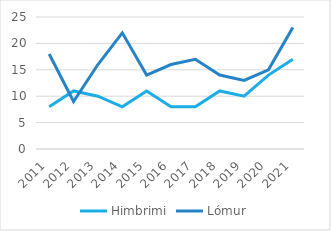
| Category | Himbrimi | Lómur |
|---|---|---|
| 2011.0 | 8 | 18 |
| 2012.0 | 11 | 9 |
| 2013.0 | 10 | 16 |
| 2014.0 | 8 | 22 |
| 2015.0 | 11 | 14 |
| 2016.0 | 8 | 16 |
| 2017.0 | 8 | 17 |
| 2018.0 | 11 | 14 |
| 2019.0 | 10 | 13 |
| 2020.0 | 14 | 15 |
| 2021.0 | 17 | 23 |